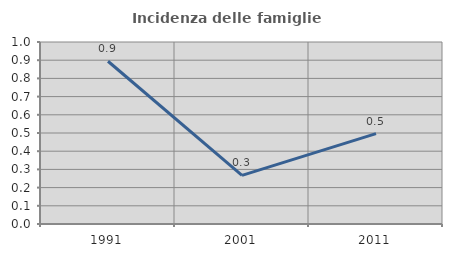
| Category | Incidenza delle famiglie numerose |
|---|---|
| 1991.0 | 0.894 |
| 2001.0 | 0.267 |
| 2011.0 | 0.497 |